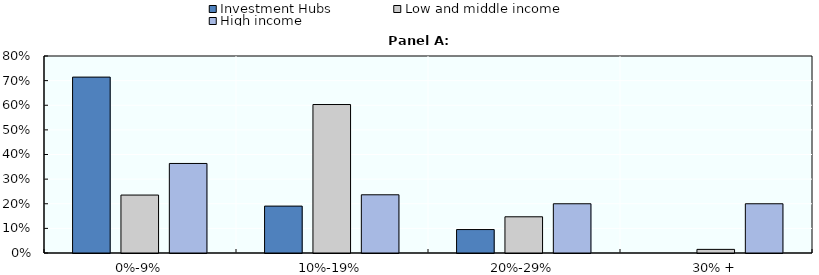
| Category | Investment Hubs | Low and middle income | High income |
|---|---|---|---|
| 0%-9% | 0.714 | 0.235 | 0.364 |
| 10%-19% | 0.19 | 0.603 | 0.236 |
| 20%-29% | 0.095 | 0.147 | 0.2 |
| 30% + | 0 | 0.015 | 0.2 |